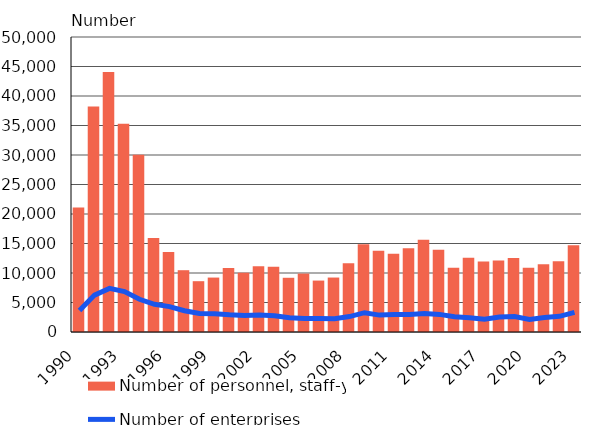
| Category | Number of personnel, staff-years |
|---|---|
| 1990.0 | 21101 |
| 1991.0 | 38200 |
| 1992.0 | 44050 |
| 1993.0 | 35282 |
| 1994.0 | 30052 |
| 1995.0 | 15922 |
| 1996.0 | 13551 |
| 1997.0 | 10473 |
| 1998.0 | 8612 |
| 1999.0 | 9226 |
| 2000.0 | 10849 |
| 2001.0 | 10047 |
| 2002.0 | 11126 |
| 2003.0 | 11061 |
| 2004.0 | 9191 |
| 2005.0 | 9898 |
| 2006.0 | 8717 |
| 2007.0 | 9230 |
| 2008.0 | 11660 |
| 2009.0 | 14860 |
| 2010.0 | 13759 |
| 2011.0 | 13270 |
| 2012.0 | 14206 |
| 2013.0 | 15637 |
| 2014.0 | 13951 |
| 2015.0 | 10902 |
| 2016.0 | 12580 |
| 2017.0 | 11943 |
| 2018.0 | 12127 |
| 2019.0 | 12548 |
| 2020.0 | 10876 |
| 2021.0 | 11490 |
| 2022.0 | 11973 |
| 2023.0 | 14719 |